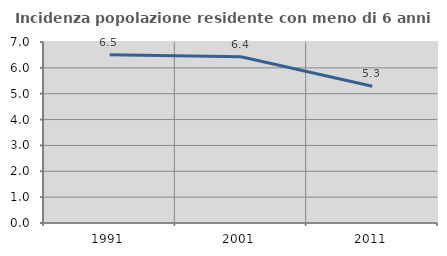
| Category | Incidenza popolazione residente con meno di 6 anni |
|---|---|
| 1991.0 | 6.502 |
| 2001.0 | 6.431 |
| 2011.0 | 5.289 |